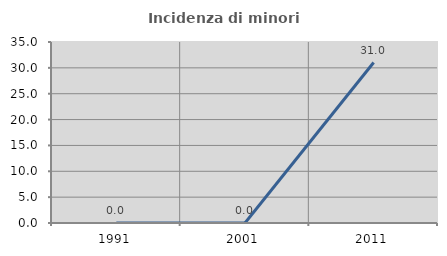
| Category | Incidenza di minori stranieri |
|---|---|
| 1991.0 | 0 |
| 2001.0 | 0 |
| 2011.0 | 31.034 |